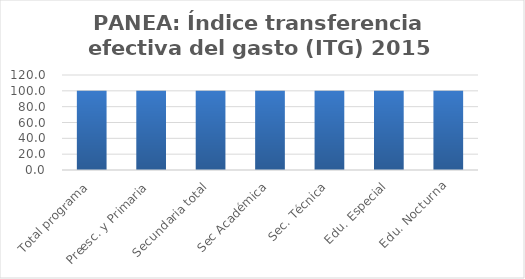
| Category | Índice transferencia efectiva del gasto (ITG) |
|---|---|
| Total programa | 100 |
| Preesc. y Primaria | 100 |
| Secundaria total | 100 |
| Sec Académica | 100 |
| Sec. Técnica | 100 |
| Edu. Especial | 100 |
| Edu. Nocturna | 100 |